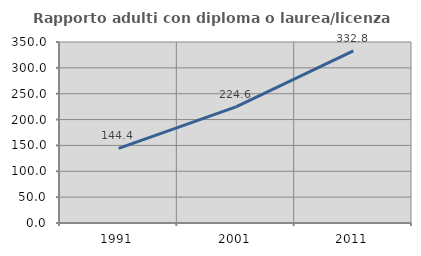
| Category | Rapporto adulti con diploma o laurea/licenza media  |
|---|---|
| 1991.0 | 144.449 |
| 2001.0 | 224.648 |
| 2011.0 | 332.828 |